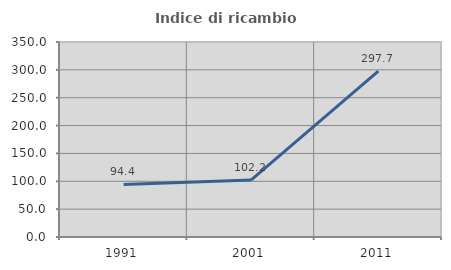
| Category | Indice di ricambio occupazionale  |
|---|---|
| 1991.0 | 94.35 |
| 2001.0 | 102.247 |
| 2011.0 | 297.701 |